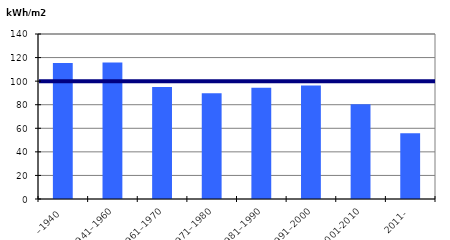
| Category | Byggårskategori |
|---|---|
| –1940 | 115.49 |
| 1941–1960 | 115.728 |
| 1961–1970 | 95.074 |
| 1971–1980 | 89.727 |
| 1981–1990 | 94.493 |
| 1991–2000 | 96.339 |
| 2001-2010 | 80.382 |
| 2011- | 55.756 |